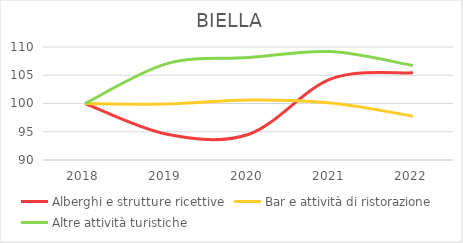
| Category | Alberghi e strutture ricettive | Bar e attività di ristorazione | Altre attività turistiche |
|---|---|---|---|
| 2018.0 | 100 | 100 | 100 |
| 2019.0 | 94.565 | 99.914 | 107.067 |
| 2020.0 | 94.565 | 100.604 | 108.127 |
| 2021.0 | 104.348 | 100.086 | 109.187 |
| 2022.0 | 105.435 | 97.755 | 106.714 |